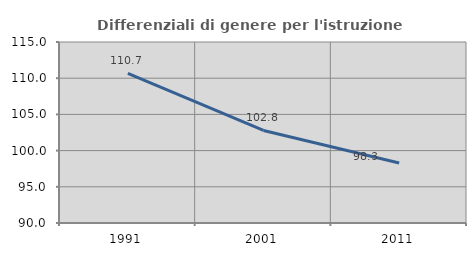
| Category | Differenziali di genere per l'istruzione superiore |
|---|---|
| 1991.0 | 110.68 |
| 2001.0 | 102.787 |
| 2011.0 | 98.286 |